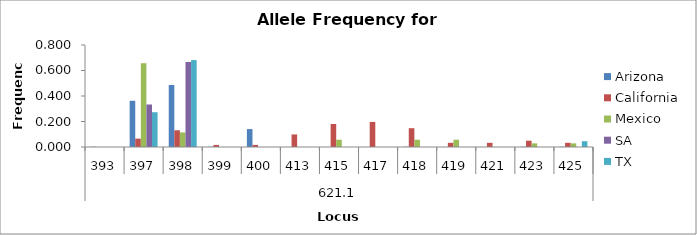
| Category | Arizona | California | Mexico | SA | TX |
|---|---|---|---|---|---|
| 0 | 0.002 | 0 | 0 | 0 | 0 |
| 1 | 0.362 | 0.066 | 0.657 | 0.333 | 0.273 |
| 2 | 0.486 | 0.131 | 0.114 | 0.667 | 0.682 |
| 3 | 0.002 | 0.016 | 0 | 0 | 0 |
| 4 | 0.141 | 0.016 | 0 | 0 | 0 |
| 5 | 0 | 0.098 | 0 | 0 | 0 |
| 6 | 0 | 0.18 | 0.057 | 0 | 0 |
| 7 | 0 | 0.197 | 0 | 0 | 0 |
| 8 | 0.002 | 0.148 | 0.057 | 0 | 0 |
| 9 | 0 | 0.033 | 0.057 | 0 | 0 |
| 10 | 0 | 0.033 | 0 | 0 | 0 |
| 11 | 0.002 | 0.049 | 0.029 | 0 | 0 |
| 12 | 0.002 | 0.033 | 0.029 | 0 | 0.045 |